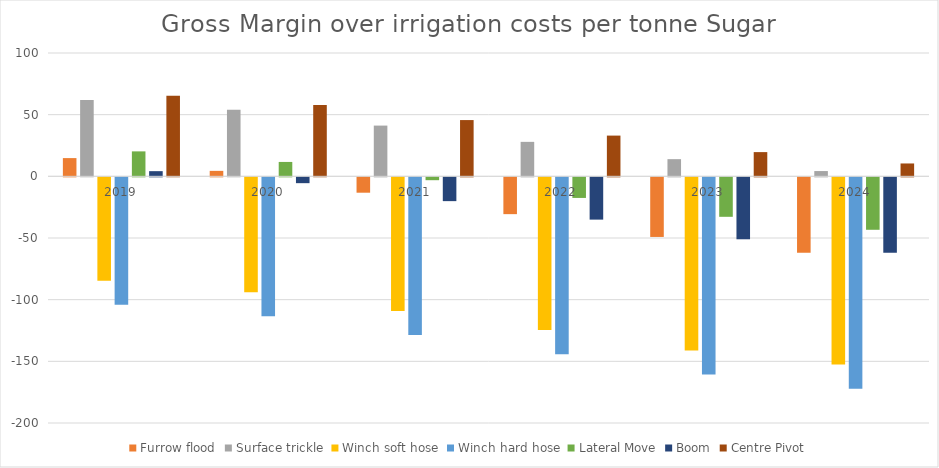
| Category | Furrow flood | Surface trickle | Winch soft hose | Winch hard hose | Lateral Move | Boom | Centre Pivot |
|---|---|---|---|---|---|---|---|
| 2019.0 | 14.788 | 61.815 | -83.843 | -103.343 | 20.236 | 4.196 | 65.354 |
| 2020.0 | 4.435 | 53.961 | -93.125 | -112.625 | 11.668 | -4.729 | 57.857 |
| 2021.0 | -12.465 | 41.14 | -108.277 | -127.777 | -2.319 | -19.298 | 45.619 |
| 2022.0 | -29.849 | 27.952 | -123.862 | -143.362 | -16.705 | -34.284 | 33.031 |
| 2023.0 | -48.339 | 13.925 | -140.44 | -159.94 | -32.007 | -50.223 | 19.642 |
| 2024.0 | -61.054 | 4.279 | -151.84 | -171.34 | -42.53 | -61.185 | 10.434 |